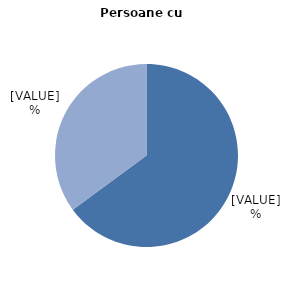
| Category | Persoane        cu       dizabilități |
|---|---|
| Salariat | 64.9 |
| Non-salariat | 35.1 |